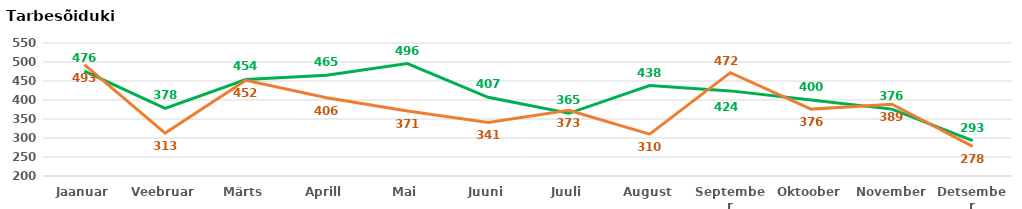
| Category | 2016 | 2015 |
|---|---|---|
| Jaanuar | 476 | 493 |
| Veebruar | 378 | 313 |
| Märts | 454 | 452 |
| Aprill | 465 | 406 |
| Mai | 496 | 371 |
| Juuni | 407 | 341 |
| Juuli | 365 | 373 |
| August | 438 | 310 |
| September | 424 | 472 |
| Oktoober | 400 | 376 |
| November | 376 | 389 |
| Detsember | 293 | 278 |